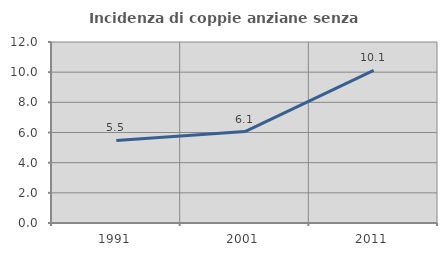
| Category | Incidenza di coppie anziane senza figli  |
|---|---|
| 1991.0 | 5.476 |
| 2001.0 | 6.061 |
| 2011.0 | 10.124 |